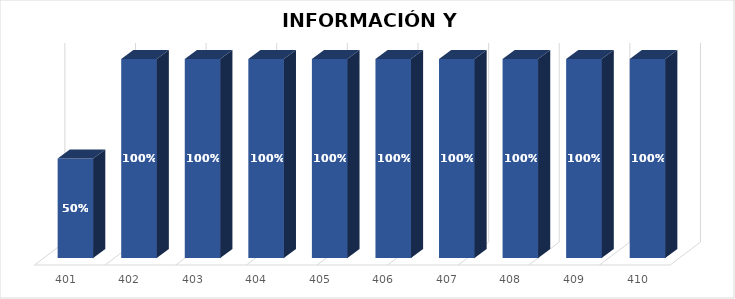
| Category | % Avance |
|---|---|
| 401.0 | 0.5 |
| 402.0 | 1 |
| 403.0 | 1 |
| 404.0 | 1 |
| 405.0 | 1 |
| 406.0 | 1 |
| 407.0 | 1 |
| 408.0 | 1 |
| 409.0 | 1 |
| 410.0 | 1 |